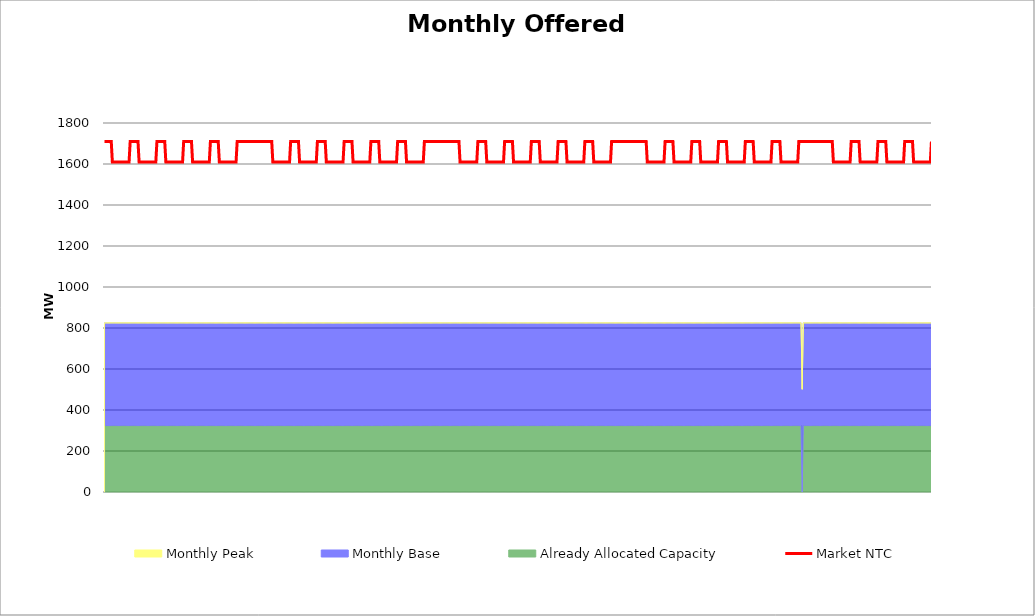
| Category | Market NTC |
|---|---|
| 0 | 1710 |
| 1 | 1710 |
| 2 | 1710 |
| 3 | 1710 |
| 4 | 1710 |
| 5 | 1710 |
| 6 | 1710 |
| 7 | 1610 |
| 8 | 1610 |
| 9 | 1610 |
| 10 | 1610 |
| 11 | 1610 |
| 12 | 1610 |
| 13 | 1610 |
| 14 | 1610 |
| 15 | 1610 |
| 16 | 1610 |
| 17 | 1610 |
| 18 | 1610 |
| 19 | 1610 |
| 20 | 1610 |
| 21 | 1610 |
| 22 | 1610 |
| 23 | 1710 |
| 24 | 1710 |
| 25 | 1710 |
| 26 | 1710 |
| 27 | 1710 |
| 28 | 1710 |
| 29 | 1710 |
| 30 | 1710 |
| 31 | 1610 |
| 32 | 1610 |
| 33 | 1610 |
| 34 | 1610 |
| 35 | 1610 |
| 36 | 1610 |
| 37 | 1610 |
| 38 | 1610 |
| 39 | 1610 |
| 40 | 1610 |
| 41 | 1610 |
| 42 | 1610 |
| 43 | 1610 |
| 44 | 1610 |
| 45 | 1610 |
| 46 | 1610 |
| 47 | 1710 |
| 48 | 1710 |
| 49 | 1710 |
| 50 | 1710 |
| 51 | 1710 |
| 52 | 1710 |
| 53 | 1710 |
| 54 | 1710 |
| 55 | 1610 |
| 56 | 1610 |
| 57 | 1610 |
| 58 | 1610 |
| 59 | 1610 |
| 60 | 1610 |
| 61 | 1610 |
| 62 | 1610 |
| 63 | 1610 |
| 64 | 1610 |
| 65 | 1610 |
| 66 | 1610 |
| 67 | 1610 |
| 68 | 1610 |
| 69 | 1610 |
| 70 | 1610 |
| 71 | 1710 |
| 72 | 1710 |
| 73 | 1710 |
| 74 | 1710 |
| 75 | 1710 |
| 76 | 1710 |
| 77 | 1710 |
| 78 | 1710 |
| 79 | 1610 |
| 80 | 1610 |
| 81 | 1610 |
| 82 | 1610 |
| 83 | 1610 |
| 84 | 1610 |
| 85 | 1610 |
| 86 | 1610 |
| 87 | 1610 |
| 88 | 1610 |
| 89 | 1610 |
| 90 | 1610 |
| 91 | 1610 |
| 92 | 1610 |
| 93 | 1610 |
| 94 | 1610 |
| 95 | 1710 |
| 96 | 1710 |
| 97 | 1710 |
| 98 | 1710 |
| 99 | 1710 |
| 100 | 1710 |
| 101 | 1710 |
| 102 | 1710 |
| 103 | 1610 |
| 104 | 1610 |
| 105 | 1610 |
| 106 | 1610 |
| 107 | 1610 |
| 108 | 1610 |
| 109 | 1610 |
| 110 | 1610 |
| 111 | 1610 |
| 112 | 1610 |
| 113 | 1610 |
| 114 | 1610 |
| 115 | 1610 |
| 116 | 1610 |
| 117 | 1610 |
| 118 | 1610 |
| 119 | 1710 |
| 120 | 1710 |
| 121 | 1710 |
| 122 | 1710 |
| 123 | 1710 |
| 124 | 1710 |
| 125 | 1710 |
| 126 | 1710 |
| 127 | 1710 |
| 128 | 1710 |
| 129 | 1710 |
| 130 | 1710 |
| 131 | 1710 |
| 132 | 1710 |
| 133 | 1710 |
| 134 | 1710 |
| 135 | 1710 |
| 136 | 1710 |
| 137 | 1710 |
| 138 | 1710 |
| 139 | 1710 |
| 140 | 1710 |
| 141 | 1710 |
| 142 | 1710 |
| 143 | 1710 |
| 144 | 1710 |
| 145 | 1710 |
| 146 | 1710 |
| 147 | 1710 |
| 148 | 1710 |
| 149 | 1710 |
| 150 | 1710 |
| 151 | 1610 |
| 152 | 1610 |
| 153 | 1610 |
| 154 | 1610 |
| 155 | 1610 |
| 156 | 1610 |
| 157 | 1610 |
| 158 | 1610 |
| 159 | 1610 |
| 160 | 1610 |
| 161 | 1610 |
| 162 | 1610 |
| 163 | 1610 |
| 164 | 1610 |
| 165 | 1610 |
| 166 | 1610 |
| 167 | 1710 |
| 168 | 1710 |
| 169 | 1710 |
| 170 | 1710 |
| 171 | 1710 |
| 172 | 1710 |
| 173 | 1710 |
| 174 | 1710 |
| 175 | 1610 |
| 176 | 1610 |
| 177 | 1610 |
| 178 | 1610 |
| 179 | 1610 |
| 180 | 1610 |
| 181 | 1610 |
| 182 | 1610 |
| 183 | 1610 |
| 184 | 1610 |
| 185 | 1610 |
| 186 | 1610 |
| 187 | 1610 |
| 188 | 1610 |
| 189 | 1610 |
| 190 | 1610 |
| 191 | 1710 |
| 192 | 1710 |
| 193 | 1710 |
| 194 | 1710 |
| 195 | 1710 |
| 196 | 1710 |
| 197 | 1710 |
| 198 | 1710 |
| 199 | 1610 |
| 200 | 1610 |
| 201 | 1610 |
| 202 | 1610 |
| 203 | 1610 |
| 204 | 1610 |
| 205 | 1610 |
| 206 | 1610 |
| 207 | 1610 |
| 208 | 1610 |
| 209 | 1610 |
| 210 | 1610 |
| 211 | 1610 |
| 212 | 1610 |
| 213 | 1610 |
| 214 | 1610 |
| 215 | 1710 |
| 216 | 1710 |
| 217 | 1710 |
| 218 | 1710 |
| 219 | 1710 |
| 220 | 1710 |
| 221 | 1710 |
| 222 | 1710 |
| 223 | 1610 |
| 224 | 1610 |
| 225 | 1610 |
| 226 | 1610 |
| 227 | 1610 |
| 228 | 1610 |
| 229 | 1610 |
| 230 | 1610 |
| 231 | 1610 |
| 232 | 1610 |
| 233 | 1610 |
| 234 | 1610 |
| 235 | 1610 |
| 236 | 1610 |
| 237 | 1610 |
| 238 | 1610 |
| 239 | 1710 |
| 240 | 1710 |
| 241 | 1710 |
| 242 | 1710 |
| 243 | 1710 |
| 244 | 1710 |
| 245 | 1710 |
| 246 | 1710 |
| 247 | 1610 |
| 248 | 1610 |
| 249 | 1610 |
| 250 | 1610 |
| 251 | 1610 |
| 252 | 1610 |
| 253 | 1610 |
| 254 | 1610 |
| 255 | 1610 |
| 256 | 1610 |
| 257 | 1610 |
| 258 | 1610 |
| 259 | 1610 |
| 260 | 1610 |
| 261 | 1610 |
| 262 | 1610 |
| 263 | 1710 |
| 264 | 1710 |
| 265 | 1710 |
| 266 | 1710 |
| 267 | 1710 |
| 268 | 1710 |
| 269 | 1710 |
| 270 | 1710 |
| 271 | 1610 |
| 272 | 1610 |
| 273 | 1610 |
| 274 | 1610 |
| 275 | 1610 |
| 276 | 1610 |
| 277 | 1610 |
| 278 | 1610 |
| 279 | 1610 |
| 280 | 1610 |
| 281 | 1610 |
| 282 | 1610 |
| 283 | 1610 |
| 284 | 1610 |
| 285 | 1610 |
| 286 | 1610 |
| 287 | 1710 |
| 288 | 1710 |
| 289 | 1710 |
| 290 | 1710 |
| 291 | 1710 |
| 292 | 1710 |
| 293 | 1710 |
| 294 | 1710 |
| 295 | 1710 |
| 296 | 1710 |
| 297 | 1710 |
| 298 | 1710 |
| 299 | 1710 |
| 300 | 1710 |
| 301 | 1710 |
| 302 | 1710 |
| 303 | 1710 |
| 304 | 1710 |
| 305 | 1710 |
| 306 | 1710 |
| 307 | 1710 |
| 308 | 1710 |
| 309 | 1710 |
| 310 | 1710 |
| 311 | 1710 |
| 312 | 1710 |
| 313 | 1710 |
| 314 | 1710 |
| 315 | 1710 |
| 316 | 1710 |
| 317 | 1710 |
| 318 | 1710 |
| 319 | 1610 |
| 320 | 1610 |
| 321 | 1610 |
| 322 | 1610 |
| 323 | 1610 |
| 324 | 1610 |
| 325 | 1610 |
| 326 | 1610 |
| 327 | 1610 |
| 328 | 1610 |
| 329 | 1610 |
| 330 | 1610 |
| 331 | 1610 |
| 332 | 1610 |
| 333 | 1610 |
| 334 | 1610 |
| 335 | 1710 |
| 336 | 1710 |
| 337 | 1710 |
| 338 | 1710 |
| 339 | 1710 |
| 340 | 1710 |
| 341 | 1710 |
| 342 | 1710 |
| 343 | 1610 |
| 344 | 1610 |
| 345 | 1610 |
| 346 | 1610 |
| 347 | 1610 |
| 348 | 1610 |
| 349 | 1610 |
| 350 | 1610 |
| 351 | 1610 |
| 352 | 1610 |
| 353 | 1610 |
| 354 | 1610 |
| 355 | 1610 |
| 356 | 1610 |
| 357 | 1610 |
| 358 | 1610 |
| 359 | 1710 |
| 360 | 1710 |
| 361 | 1710 |
| 362 | 1710 |
| 363 | 1710 |
| 364 | 1710 |
| 365 | 1710 |
| 366 | 1710 |
| 367 | 1610 |
| 368 | 1610 |
| 369 | 1610 |
| 370 | 1610 |
| 371 | 1610 |
| 372 | 1610 |
| 373 | 1610 |
| 374 | 1610 |
| 375 | 1610 |
| 376 | 1610 |
| 377 | 1610 |
| 378 | 1610 |
| 379 | 1610 |
| 380 | 1610 |
| 381 | 1610 |
| 382 | 1610 |
| 383 | 1710 |
| 384 | 1710 |
| 385 | 1710 |
| 386 | 1710 |
| 387 | 1710 |
| 388 | 1710 |
| 389 | 1710 |
| 390 | 1710 |
| 391 | 1610 |
| 392 | 1610 |
| 393 | 1610 |
| 394 | 1610 |
| 395 | 1610 |
| 396 | 1610 |
| 397 | 1610 |
| 398 | 1610 |
| 399 | 1610 |
| 400 | 1610 |
| 401 | 1610 |
| 402 | 1610 |
| 403 | 1610 |
| 404 | 1610 |
| 405 | 1610 |
| 406 | 1610 |
| 407 | 1710 |
| 408 | 1710 |
| 409 | 1710 |
| 410 | 1710 |
| 411 | 1710 |
| 412 | 1710 |
| 413 | 1710 |
| 414 | 1710 |
| 415 | 1610 |
| 416 | 1610 |
| 417 | 1610 |
| 418 | 1610 |
| 419 | 1610 |
| 420 | 1610 |
| 421 | 1610 |
| 422 | 1610 |
| 423 | 1610 |
| 424 | 1610 |
| 425 | 1610 |
| 426 | 1610 |
| 427 | 1610 |
| 428 | 1610 |
| 429 | 1610 |
| 430 | 1610 |
| 431 | 1710 |
| 432 | 1710 |
| 433 | 1710 |
| 434 | 1710 |
| 435 | 1710 |
| 436 | 1710 |
| 437 | 1710 |
| 438 | 1710 |
| 439 | 1610 |
| 440 | 1610 |
| 441 | 1610 |
| 442 | 1610 |
| 443 | 1610 |
| 444 | 1610 |
| 445 | 1610 |
| 446 | 1610 |
| 447 | 1610 |
| 448 | 1610 |
| 449 | 1610 |
| 450 | 1610 |
| 451 | 1610 |
| 452 | 1610 |
| 453 | 1610 |
| 454 | 1610 |
| 455 | 1710 |
| 456 | 1710 |
| 457 | 1710 |
| 458 | 1710 |
| 459 | 1710 |
| 460 | 1710 |
| 461 | 1710 |
| 462 | 1710 |
| 463 | 1710 |
| 464 | 1710 |
| 465 | 1710 |
| 466 | 1710 |
| 467 | 1710 |
| 468 | 1710 |
| 469 | 1710 |
| 470 | 1710 |
| 471 | 1710 |
| 472 | 1710 |
| 473 | 1710 |
| 474 | 1710 |
| 475 | 1710 |
| 476 | 1710 |
| 477 | 1710 |
| 478 | 1710 |
| 479 | 1710 |
| 480 | 1710 |
| 481 | 1710 |
| 482 | 1710 |
| 483 | 1710 |
| 484 | 1710 |
| 485 | 1710 |
| 486 | 1710 |
| 487 | 1610 |
| 488 | 1610 |
| 489 | 1610 |
| 490 | 1610 |
| 491 | 1610 |
| 492 | 1610 |
| 493 | 1610 |
| 494 | 1610 |
| 495 | 1610 |
| 496 | 1610 |
| 497 | 1610 |
| 498 | 1610 |
| 499 | 1610 |
| 500 | 1610 |
| 501 | 1610 |
| 502 | 1610 |
| 503 | 1710 |
| 504 | 1710 |
| 505 | 1710 |
| 506 | 1710 |
| 507 | 1710 |
| 508 | 1710 |
| 509 | 1710 |
| 510 | 1710 |
| 511 | 1610 |
| 512 | 1610 |
| 513 | 1610 |
| 514 | 1610 |
| 515 | 1610 |
| 516 | 1610 |
| 517 | 1610 |
| 518 | 1610 |
| 519 | 1610 |
| 520 | 1610 |
| 521 | 1610 |
| 522 | 1610 |
| 523 | 1610 |
| 524 | 1610 |
| 525 | 1610 |
| 526 | 1610 |
| 527 | 1710 |
| 528 | 1710 |
| 529 | 1710 |
| 530 | 1710 |
| 531 | 1710 |
| 532 | 1710 |
| 533 | 1710 |
| 534 | 1710 |
| 535 | 1610 |
| 536 | 1610 |
| 537 | 1610 |
| 538 | 1610 |
| 539 | 1610 |
| 540 | 1610 |
| 541 | 1610 |
| 542 | 1610 |
| 543 | 1610 |
| 544 | 1610 |
| 545 | 1610 |
| 546 | 1610 |
| 547 | 1610 |
| 548 | 1610 |
| 549 | 1610 |
| 550 | 1610 |
| 551 | 1710 |
| 552 | 1710 |
| 553 | 1710 |
| 554 | 1710 |
| 555 | 1710 |
| 556 | 1710 |
| 557 | 1710 |
| 558 | 1710 |
| 559 | 1610 |
| 560 | 1610 |
| 561 | 1610 |
| 562 | 1610 |
| 563 | 1610 |
| 564 | 1610 |
| 565 | 1610 |
| 566 | 1610 |
| 567 | 1610 |
| 568 | 1610 |
| 569 | 1610 |
| 570 | 1610 |
| 571 | 1610 |
| 572 | 1610 |
| 573 | 1610 |
| 574 | 1610 |
| 575 | 1710 |
| 576 | 1710 |
| 577 | 1710 |
| 578 | 1710 |
| 579 | 1710 |
| 580 | 1710 |
| 581 | 1710 |
| 582 | 1710 |
| 583 | 1610 |
| 584 | 1610 |
| 585 | 1610 |
| 586 | 1610 |
| 587 | 1610 |
| 588 | 1610 |
| 589 | 1610 |
| 590 | 1610 |
| 591 | 1610 |
| 592 | 1610 |
| 593 | 1610 |
| 594 | 1610 |
| 595 | 1610 |
| 596 | 1610 |
| 597 | 1610 |
| 598 | 1610 |
| 599 | 1710 |
| 600 | 1710 |
| 601 | 1710 |
| 602 | 1710 |
| 603 | 1710 |
| 604 | 1710 |
| 605 | 1710 |
| 606 | 1710 |
| 607 | 1610 |
| 608 | 1610 |
| 609 | 1610 |
| 610 | 1610 |
| 611 | 1610 |
| 612 | 1610 |
| 613 | 1610 |
| 614 | 1610 |
| 615 | 1610 |
| 616 | 1610 |
| 617 | 1610 |
| 618 | 1610 |
| 619 | 1610 |
| 620 | 1610 |
| 621 | 1610 |
| 622 | 1610 |
| 623 | 1710 |
| 624 | 1710 |
| 625 | 1710 |
| 626 | 1710 |
| 627 | 1710 |
| 628 | 1710 |
| 629 | 1710 |
| 630 | 1710 |
| 631 | 1710 |
| 632 | 1710 |
| 633 | 1710 |
| 634 | 1710 |
| 635 | 1710 |
| 636 | 1710 |
| 637 | 1710 |
| 638 | 1710 |
| 639 | 1710 |
| 640 | 1710 |
| 641 | 1710 |
| 642 | 1710 |
| 643 | 1710 |
| 644 | 1710 |
| 645 | 1710 |
| 646 | 1710 |
| 647 | 1710 |
| 648 | 1710 |
| 649 | 1710 |
| 650 | 1710 |
| 651 | 1710 |
| 652 | 1710 |
| 653 | 1710 |
| 654 | 1610 |
| 655 | 1610 |
| 656 | 1610 |
| 657 | 1610 |
| 658 | 1610 |
| 659 | 1610 |
| 660 | 1610 |
| 661 | 1610 |
| 662 | 1610 |
| 663 | 1610 |
| 664 | 1610 |
| 665 | 1610 |
| 666 | 1610 |
| 667 | 1610 |
| 668 | 1610 |
| 669 | 1610 |
| 670 | 1710 |
| 671 | 1710 |
| 672 | 1710 |
| 673 | 1710 |
| 674 | 1710 |
| 675 | 1710 |
| 676 | 1710 |
| 677 | 1710 |
| 678 | 1610 |
| 679 | 1610 |
| 680 | 1610 |
| 681 | 1610 |
| 682 | 1610 |
| 683 | 1610 |
| 684 | 1610 |
| 685 | 1610 |
| 686 | 1610 |
| 687 | 1610 |
| 688 | 1610 |
| 689 | 1610 |
| 690 | 1610 |
| 691 | 1610 |
| 692 | 1610 |
| 693 | 1610 |
| 694 | 1710 |
| 695 | 1710 |
| 696 | 1710 |
| 697 | 1710 |
| 698 | 1710 |
| 699 | 1710 |
| 700 | 1710 |
| 701 | 1710 |
| 702 | 1610 |
| 703 | 1610 |
| 704 | 1610 |
| 705 | 1610 |
| 706 | 1610 |
| 707 | 1610 |
| 708 | 1610 |
| 709 | 1610 |
| 710 | 1610 |
| 711 | 1610 |
| 712 | 1610 |
| 713 | 1610 |
| 714 | 1610 |
| 715 | 1610 |
| 716 | 1610 |
| 717 | 1610 |
| 718 | 1710 |
| 719 | 1710 |
| 720 | 1710 |
| 721 | 1710 |
| 722 | 1710 |
| 723 | 1710 |
| 724 | 1710 |
| 725 | 1710 |
| 726 | 1610 |
| 727 | 1610 |
| 728 | 1610 |
| 729 | 1610 |
| 730 | 1610 |
| 731 | 1610 |
| 732 | 1610 |
| 733 | 1610 |
| 734 | 1610 |
| 735 | 1610 |
| 736 | 1610 |
| 737 | 1610 |
| 738 | 1610 |
| 739 | 1610 |
| 740 | 1610 |
| 741 | 1610 |
| 742 | 1710 |